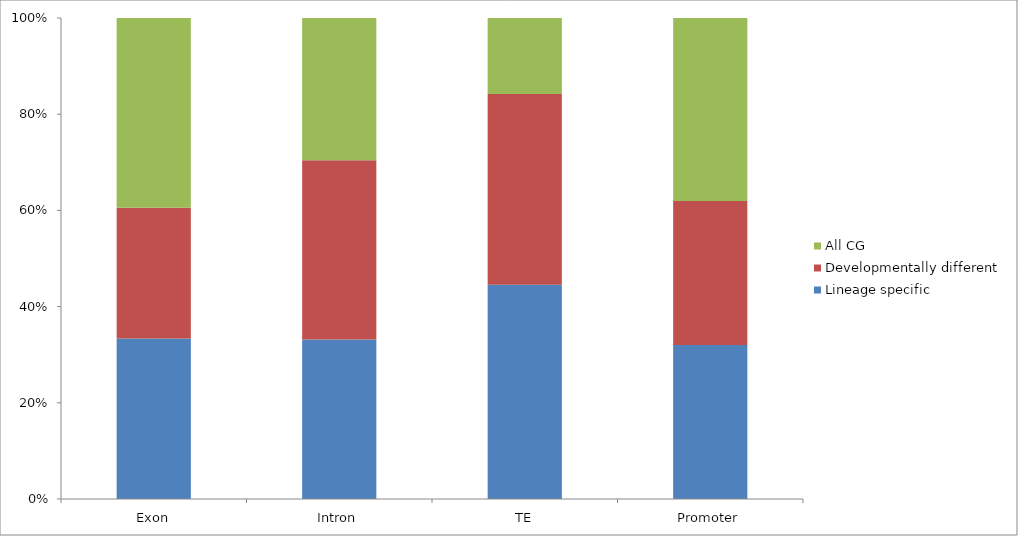
| Category | Lineage specific | Developmentally different | All CG |
|---|---|---|---|
| Exon | 0.095 | 0.078 | 0.113 |
| Intron | 0.315 | 0.354 | 0.281 |
| TE | 0.166 | 0.147 | 0.059 |
| Promoter | 0.05 | 0.047 | 0.059 |